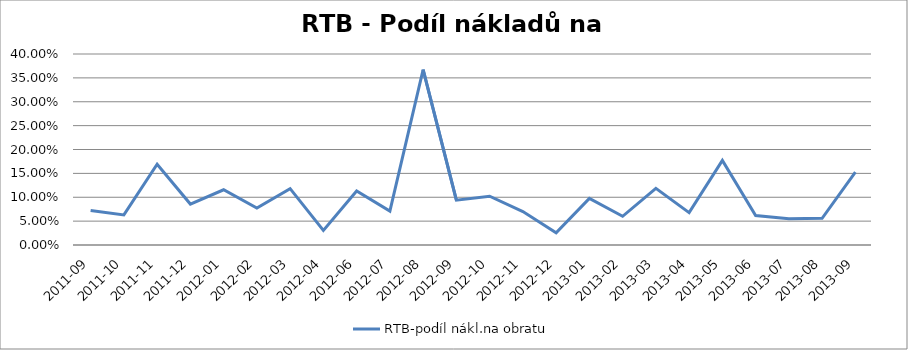
| Category | RTB-podíl nákl.na obratu |
|---|---|
| 2011-09 | 0.072 |
| 2011-10 | 0.063 |
| 2011-11 | 0.169 |
| 2011-12 | 0.086 |
| 2012-01 | 0.116 |
| 2012-02 | 0.077 |
| 2012-03 | 0.118 |
| 2012-04 | 0.031 |
| 2012-06 | 0.113 |
| 2012-07 | 0.071 |
| 2012-08 | 0.367 |
| 2012-09 | 0.094 |
| 2012-10 | 0.102 |
| 2012-11 | 0.07 |
| 2012-12 | 0.025 |
| 2013-01 | 0.098 |
| 2013-02 | 0.06 |
| 2013-03 | 0.119 |
| 2013-04 | 0.068 |
| 2013-05 | 0.177 |
| 2013-06 | 0.062 |
| 2013-07 | 0.055 |
| 2013-08 | 0.056 |
| 2013-09 | 0.152 |